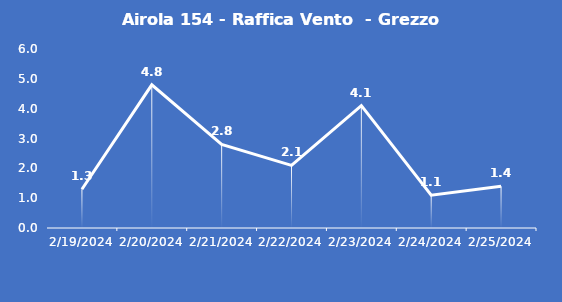
| Category | Airola 154 - Raffica Vento  - Grezzo (m/s) |
|---|---|
| 2/19/24 | 1.3 |
| 2/20/24 | 4.8 |
| 2/21/24 | 2.8 |
| 2/22/24 | 2.1 |
| 2/23/24 | 4.1 |
| 2/24/24 | 1.1 |
| 2/25/24 | 1.4 |